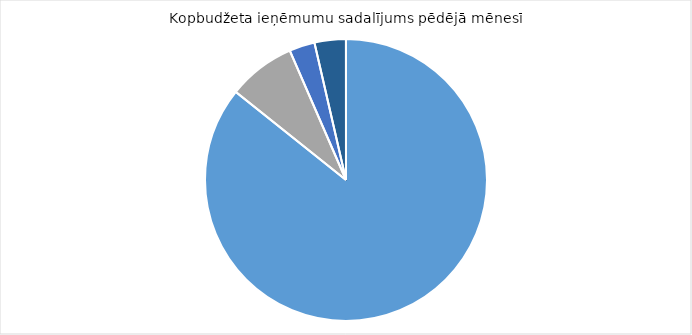
| Category | Series 0 |
|---|---|
| Nodokļu ieņēmumi, t.sk. VSAOI | 978678.559 |
| Nenodokļu ieņēmumi | 88414.716 |
| Pašu ieņēmumi | 33419.566 |
| Ārvalstu finanšu palīdzība | 40998.9 |
| Pārējie ieņēmumi | 71.814 |